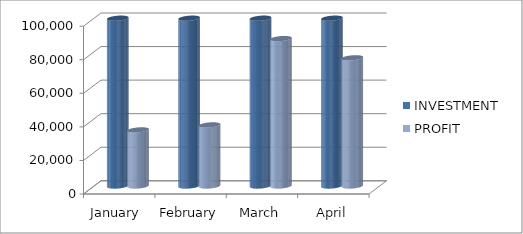
| Category | INVESTMENT  | PROFIT |
|---|---|---|
| January  | 100000 | 33435 |
| February | 100000 | 36400 |
| March | 100000 | 87850 |
| April | 100000 | 76402 |